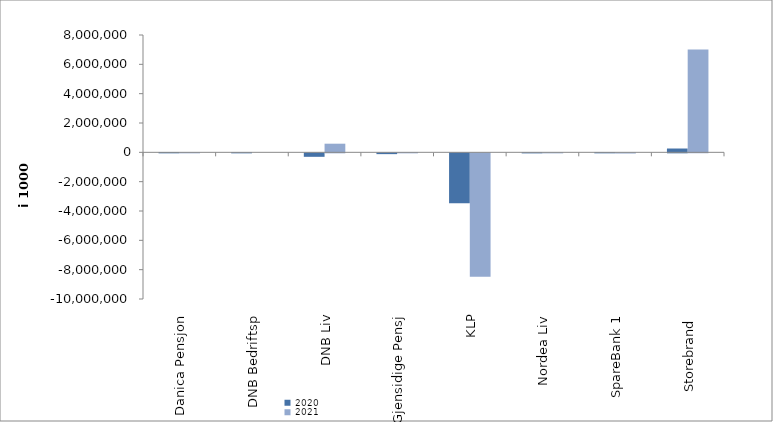
| Category | 2020 | 2021 |
|---|---|---|
| Danica Pensjon | 12646.076 | 6173.451 |
| DNB Bedriftsp | 3182 | 0 |
| DNB Liv | -237818 | 588558 |
| Gjensidige Pensj | -54730 | 6474 |
| KLP | -3411565.277 | -8418803.518 |
| Nordea Liv | -3278 | -1770 |
| SpareBank 1 | 3146.39 | -11830.833 |
| Storebrand  | 260683.625 | 7017389.998 |